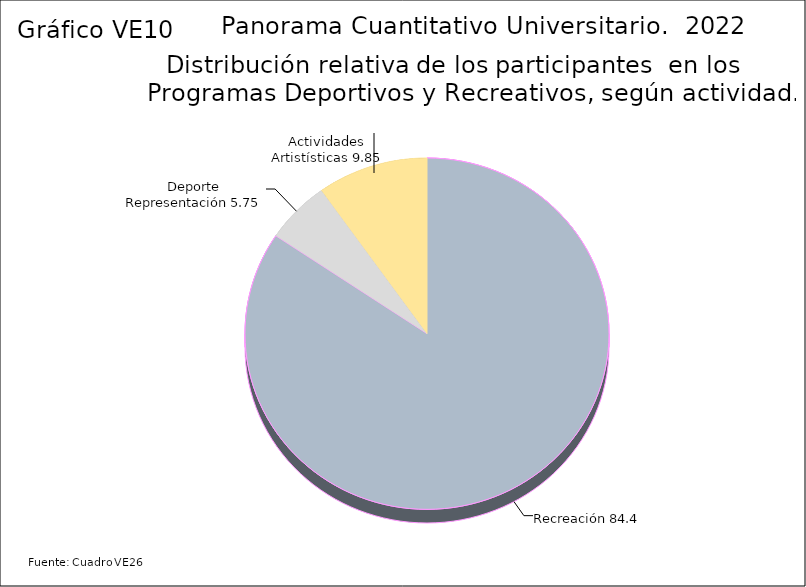
| Category | Series 3 |
|---|---|
| Recreación | 84.4 |
| Deporte Representación | 5.75 |
| Actividades Artistísticas | 9.85 |